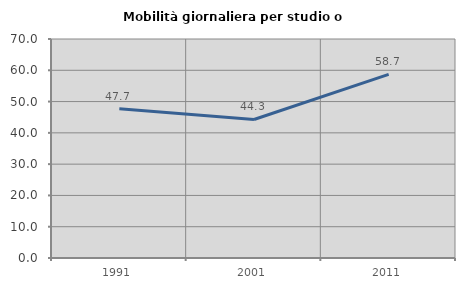
| Category | Mobilità giornaliera per studio o lavoro |
|---|---|
| 1991.0 | 47.724 |
| 2001.0 | 44.272 |
| 2011.0 | 58.672 |